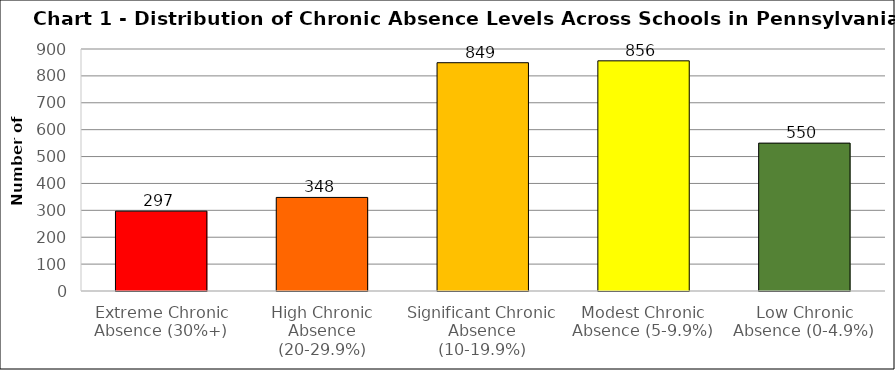
| Category | Series 0 |
|---|---|
| Extreme Chronic Absence (30%+) | 297 |
| High Chronic Absence (20-29.9%) | 348 |
| Significant Chronic Absence (10-19.9%) | 849 |
| Modest Chronic Absence (5-9.9%) | 856 |
| Low Chronic Absence (0-4.9%) | 550 |